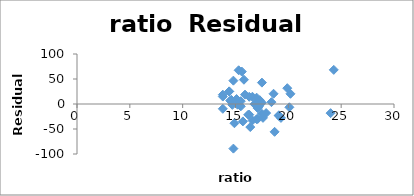
| Category | Series 0 |
|---|---|
| 17.2 | -5.287 |
| 17.6 | -27.71 |
| 19.3 | -27.822 |
| 17.1 | -29.937 |
| 24.0 | -18.301 |
| 18.4 | 3.713 |
| 14.4 | 25.153 |
| 16.6 | 14.484 |
| 19.1 | -23.624 |
| 16.3 | -21.33 |
| 17.9 | -18.107 |
| 19.1 | -22.605 |
| 17.3 | 7.591 |
| 17.5 | -19.626 |
| 15.8 | 48.541 |
| 15.1 | 9.929 |
| 17.0 | -30.316 |
| 16.8 | -0.277 |
| 13.8 | 18.626 |
| 17.0 | 12.641 |
| 14.8 | 46.705 |
| 20.1 | -6.535 |
| 17.5 | 42.756 |
| 17.5 | 2.493 |
| 15.5 | 5.624 |
| 16.3 | 14.432 |
| 14.5 | 6.666 |
| 18.7 | -55.658 |
| 15.6 | 64.79 |
| 13.8 | -9.575 |
| 17.2 | -3.781 |
| 15.2 | -1.319 |
| 16.2 | -21.537 |
| 15.3 | 67.453 |
| 16.6 | -32.813 |
| 15.5 | -4.675 |
| 19.9 | 31.597 |
| 17.1 | -8.24 |
| 14.7 | -1.724 |
| 16.4 | -46.123 |
| 14.4 | 25.127 |
| 18.6 | 20.459 |
| 15.7 | -34.827 |
| 24.3 | 68.262 |
| 13.8 | 14.861 |
| 14.6 | 8.454 |
| 20.2 | 20.385 |
| 14.8 | -89.244 |
| 15.9 | 18.743 |
| 14.9 | -38.491 |